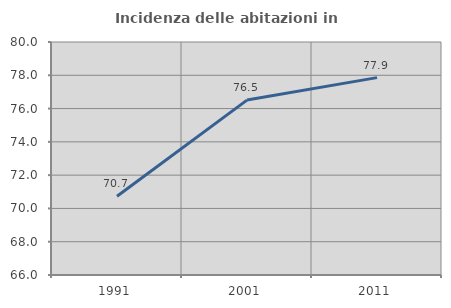
| Category | Incidenza delle abitazioni in proprietà  |
|---|---|
| 1991.0 | 70.734 |
| 2001.0 | 76.509 |
| 2011.0 | 77.86 |